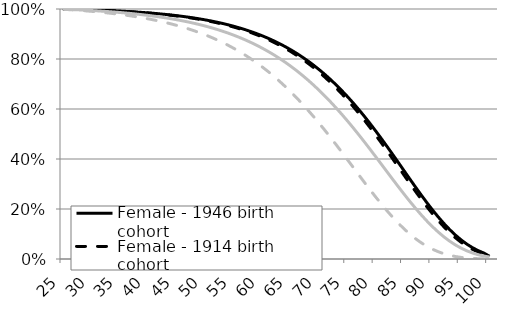
| Category | Female - 1946 birth cohort | Female - 1914 birth cohort | Male - 1946 birth cohort | Male - 1914 birth cohort |
|---|---|---|---|---|
| 25.0 | 1 | 0.999 | 0.999 | 0.999 |
| 26.0 | 0.999 | 0.999 | 0.998 | 0.997 |
| 27.0 | 0.998 | 0.998 | 0.997 | 0.996 |
| 28.0 | 0.998 | 0.998 | 0.996 | 0.994 |
| 29.0 | 0.997 | 0.997 | 0.995 | 0.992 |
| 30.0 | 0.996 | 0.996 | 0.994 | 0.99 |
| 31.0 | 0.996 | 0.995 | 0.992 | 0.988 |
| 32.0 | 0.995 | 0.994 | 0.991 | 0.986 |
| 33.0 | 0.994 | 0.993 | 0.989 | 0.984 |
| 34.0 | 0.993 | 0.992 | 0.988 | 0.981 |
| 35.0 | 0.992 | 0.991 | 0.986 | 0.978 |
| 36.0 | 0.99 | 0.99 | 0.984 | 0.975 |
| 37.0 | 0.989 | 0.989 | 0.982 | 0.972 |
| 38.0 | 0.988 | 0.987 | 0.979 | 0.968 |
| 39.0 | 0.986 | 0.985 | 0.977 | 0.964 |
| 40.0 | 0.984 | 0.984 | 0.974 | 0.96 |
| 41.0 | 0.982 | 0.982 | 0.971 | 0.956 |
| 42.0 | 0.98 | 0.979 | 0.968 | 0.951 |
| 43.0 | 0.978 | 0.977 | 0.964 | 0.945 |
| 44.0 | 0.976 | 0.975 | 0.961 | 0.94 |
| 45.0 | 0.973 | 0.972 | 0.957 | 0.934 |
| 46.0 | 0.97 | 0.969 | 0.952 | 0.927 |
| 47.0 | 0.967 | 0.966 | 0.948 | 0.92 |
| 48.0 | 0.964 | 0.962 | 0.943 | 0.913 |
| 49.0 | 0.96 | 0.958 | 0.937 | 0.905 |
| 50.0 | 0.956 | 0.954 | 0.931 | 0.896 |
| 51.0 | 0.952 | 0.95 | 0.925 | 0.886 |
| 52.0 | 0.947 | 0.945 | 0.918 | 0.876 |
| 53.0 | 0.942 | 0.939 | 0.911 | 0.866 |
| 54.0 | 0.937 | 0.934 | 0.903 | 0.854 |
| 55.0 | 0.931 | 0.927 | 0.895 | 0.842 |
| 56.0 | 0.924 | 0.921 | 0.886 | 0.829 |
| 57.0 | 0.917 | 0.913 | 0.876 | 0.815 |
| 58.0 | 0.909 | 0.905 | 0.866 | 0.8 |
| 59.0 | 0.901 | 0.897 | 0.855 | 0.784 |
| 60.0 | 0.892 | 0.887 | 0.843 | 0.768 |
| 61.0 | 0.883 | 0.878 | 0.83 | 0.75 |
| 62.0 | 0.873 | 0.867 | 0.817 | 0.731 |
| 63.0 | 0.861 | 0.855 | 0.802 | 0.711 |
| 64.0 | 0.85 | 0.843 | 0.787 | 0.69 |
| 65.0 | 0.837 | 0.829 | 0.771 | 0.668 |
| 66.0 | 0.823 | 0.815 | 0.754 | 0.645 |
| 67.0 | 0.808 | 0.8 | 0.735 | 0.621 |
| 68.0 | 0.792 | 0.783 | 0.716 | 0.596 |
| 69.0 | 0.775 | 0.766 | 0.696 | 0.57 |
| 70.0 | 0.757 | 0.747 | 0.674 | 0.543 |
| 71.0 | 0.738 | 0.727 | 0.652 | 0.515 |
| 72.0 | 0.718 | 0.706 | 0.628 | 0.486 |
| 73.0 | 0.696 | 0.684 | 0.604 | 0.457 |
| 74.0 | 0.673 | 0.66 | 0.578 | 0.427 |
| 75.0 | 0.649 | 0.635 | 0.552 | 0.397 |
| 76.0 | 0.624 | 0.609 | 0.524 | 0.366 |
| 77.0 | 0.597 | 0.582 | 0.496 | 0.336 |
| 78.0 | 0.569 | 0.554 | 0.467 | 0.305 |
| 79.0 | 0.54 | 0.524 | 0.438 | 0.276 |
| 80.0 | 0.511 | 0.494 | 0.408 | 0.247 |
| 81.0 | 0.48 | 0.463 | 0.378 | 0.218 |
| 82.0 | 0.448 | 0.431 | 0.347 | 0.191 |
| 83.0 | 0.416 | 0.399 | 0.317 | 0.166 |
| 84.0 | 0.384 | 0.366 | 0.287 | 0.142 |
| 85.0 | 0.351 | 0.333 | 0.258 | 0.119 |
| 86.0 | 0.319 | 0.301 | 0.23 | 0.099 |
| 87.0 | 0.287 | 0.269 | 0.202 | 0.081 |
| 88.0 | 0.255 | 0.238 | 0.176 | 0.065 |
| 89.0 | 0.224 | 0.208 | 0.151 | 0.051 |
| 90.0 | 0.195 | 0.18 | 0.128 | 0.039 |
| 91.0 | 0.167 | 0.153 | 0.107 | 0.029 |
| 92.0 | 0.141 | 0.128 | 0.088 | 0.021 |
| 93.0 | 0.117 | 0.105 | 0.071 | 0.015 |
| 94.0 | 0.096 | 0.085 | 0.056 | 0.01 |
| 95.0 | 0.076 | 0.067 | 0.043 | 0.006 |
| 96.0 | 0.06 | 0.051 | 0.033 | 0.004 |
| 97.0 | 0.045 | 0.039 | 0.024 | 0.002 |
| 98.0 | 0.034 | 0.028 | 0.017 | 0.001 |
| 99.0 | 0.024 | 0.02 | 0.012 | 0.001 |
| 100.0 | 0.011 | 0.009 | 0.008 | 0 |